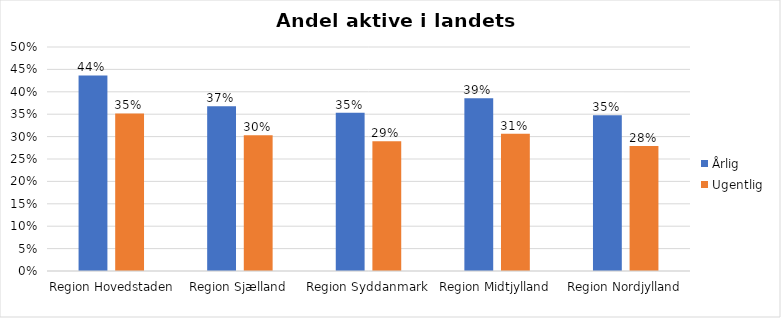
| Category | Årlig | Ugentlig |
|---|---|---|
| Region Hovedstaden | 0.437 | 0.352 |
| Region Sjælland | 0.368 | 0.303 |
| Region Syddanmark | 0.353 | 0.29 |
| Region Midtjylland | 0.386 | 0.307 |
| Region Nordjylland | 0.348 | 0.279 |